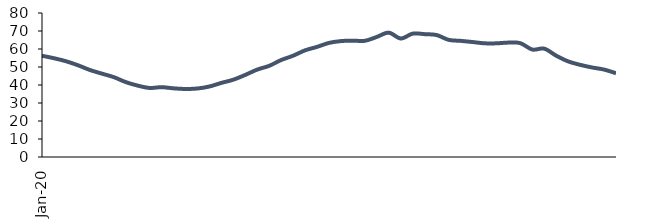
| Category | Series 0 |
|---|---|
| 2020-01-01 | 56.256 |
| 2020-02-01 | 54.873 |
| 2020-03-01 | 53.212 |
| 2020-04-01 | 50.982 |
| 2020-05-01 | 48.355 |
| 2020-06-01 | 46.331 |
| 2020-07-01 | 44.38 |
| 2020-08-01 | 41.619 |
| 2020-09-01 | 39.667 |
| 2020-10-01 | 38.362 |
| 2020-11-01 | 38.792 |
| 2020-12-01 | 38.145 |
| 2021-01-01 | 37.796 |
| 2021-02-01 | 38.055 |
| 2021-03-01 | 39.169 |
| 2021-04-01 | 41.169 |
| 2021-05-01 | 42.952 |
| 2021-06-01 | 45.61 |
| 2021-07-01 | 48.568 |
| 2021-08-01 | 50.651 |
| 2021-09-01 | 53.87 |
| 2021-10-01 | 56.277 |
| 2021-11-01 | 59.262 |
| 2021-12-01 | 61.182 |
| 2022-01-01 | 63.387 |
| 2022-02-01 | 64.392 |
| 2022-03-01 | 64.636 |
| 2022-04-01 | 64.553 |
| 2022-05-01 | 66.706 |
| 2022-06-01 | 69.09 |
| 2022-07-01 | 65.835 |
| 2022-08-01 | 68.552 |
| 2022-09-01 | 68.253 |
| 2022-10-01 | 67.758 |
| 2022-11-01 | 65.088 |
| 2022-12-01 | 64.531 |
| 2023-01-01 | 63.88 |
| 2023-02-01 | 63.159 |
| 2023-03-01 | 63.145 |
| 2023-04-01 | 63.558 |
| 2023-05-01 | 63.246 |
| 2023-06-01 | 59.697 |
| 2023-07-01 | 60.197 |
| 2023-08-01 | 56.277 |
| 2023-09-01 | 53.115 |
| 2023-10-01 | 51.209 |
| 2023-11-01 | 49.736 |
| 2023-12-01 | 48.573 |
| 2024-01-01 | 46.536 |